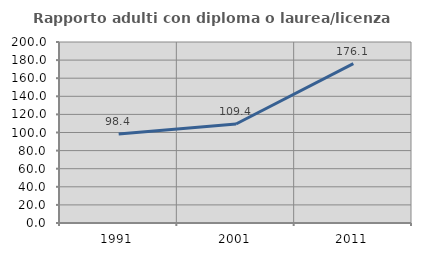
| Category | Rapporto adulti con diploma o laurea/licenza media  |
|---|---|
| 1991.0 | 98.387 |
| 2001.0 | 109.412 |
| 2011.0 | 176.056 |